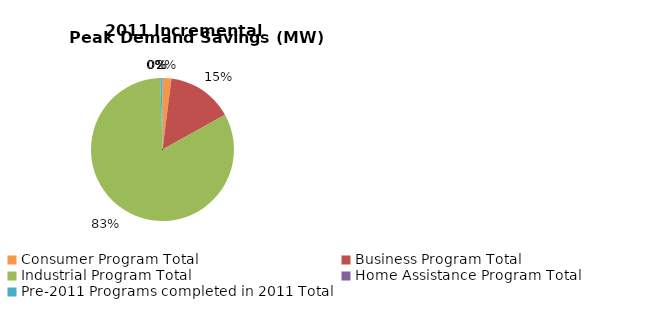
| Category | Incremental Peak Demand Savings (kW) |
|---|---|
| Consumer Program Total | 31.93 |
| Business Program Total | 236.18 |
| Industrial Program Total | 1308.806 |
| Home Assistance Program Total | 0 |
| Pre-2011 Programs completed in 2011 Total | 7.942 |